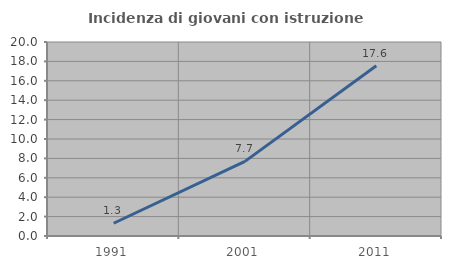
| Category | Incidenza di giovani con istruzione universitaria |
|---|---|
| 1991.0 | 1.316 |
| 2001.0 | 7.692 |
| 2011.0 | 17.557 |